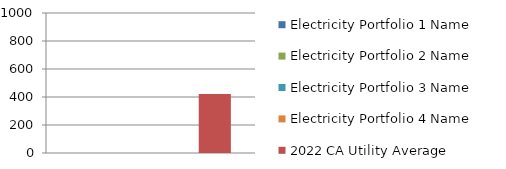
| Category | Electricity Portfolio 1 Name | Electricity Portfolio 2 Name | Electricity Portfolio 3 Name | Electricity Portfolio 4 Name | 2022 CA Utility Average |
|---|---|---|---|---|---|
| 0 | 0 | 0 | 0 | 0 | 422 |